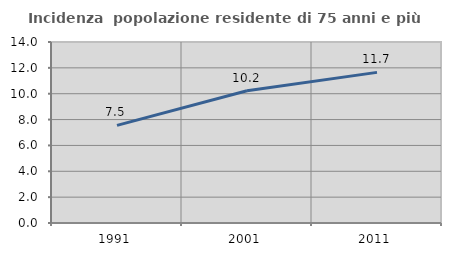
| Category | Incidenza  popolazione residente di 75 anni e più |
|---|---|
| 1991.0 | 7.548 |
| 2001.0 | 10.224 |
| 2011.0 | 11.651 |